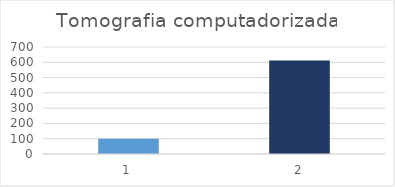
| Category | Tomografia computadorizada |
|---|---|
| 0 | 100 |
| 1 | 611 |